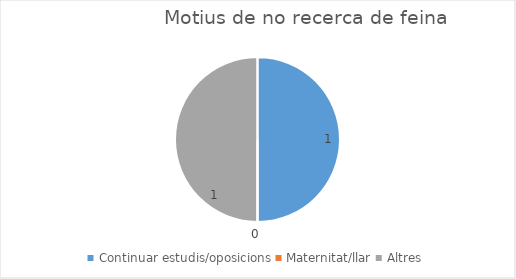
| Category | Series 0 |
|---|---|
| Continuar estudis/oposicions | 1 |
| Maternitat/llar | 0 |
| Altres | 1 |